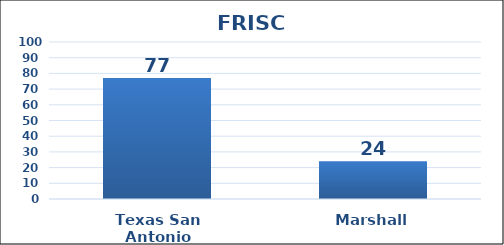
| Category | Series 0 |
|---|---|
| Texas San Antonio | 77 |
| Marshall | 24 |